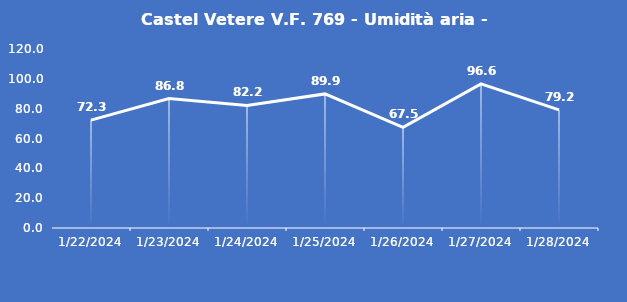
| Category | Castel Vetere V.F. 769 - Umidità aria - Grezzo (%) |
|---|---|
| 1/22/24 | 72.3 |
| 1/23/24 | 86.8 |
| 1/24/24 | 82.2 |
| 1/25/24 | 89.9 |
| 1/26/24 | 67.5 |
| 1/27/24 | 96.6 |
| 1/28/24 | 79.2 |